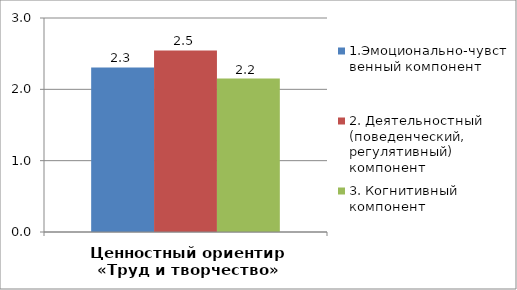
| Category | 1.Эмоционально-чувственный компонент | 2. Деятельностный (поведенческий, регулятивный) компонент | 3. Когнитивный компонент |
|---|---|---|---|
| Ценностный ориентир «Труд и творчество» | 2.308 | 2.545 | 2.152 |